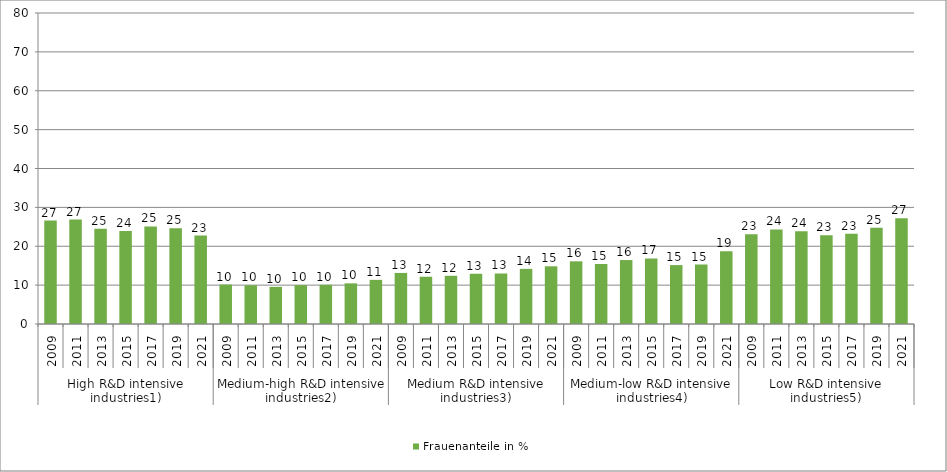
| Category | Frauenanteile in % |
|---|---|
| 0 | 26.611 |
| 1 | 26.856 |
| 2 | 24.528 |
| 3 | 23.919 |
| 4 | 25.107 |
| 5 | 24.654 |
| 6 | 22.764 |
| 7 | 10.147 |
| 8 | 9.979 |
| 9 | 9.555 |
| 10 | 10.007 |
| 11 | 10.083 |
| 12 | 10.452 |
| 13 | 11.354 |
| 14 | 13.135 |
| 15 | 12.157 |
| 16 | 12.403 |
| 17 | 12.925 |
| 18 | 12.991 |
| 19 | 14.183 |
| 20 | 14.842 |
| 21 | 16.12 |
| 22 | 15.438 |
| 23 | 16.45 |
| 24 | 16.862 |
| 25 | 15.149 |
| 26 | 15.305 |
| 27 | 18.684 |
| 28 | 23.067 |
| 29 | 24.338 |
| 30 | 23.858 |
| 31 | 22.83 |
| 32 | 23.224 |
| 33 | 24.782 |
| 34 | 27.229 |